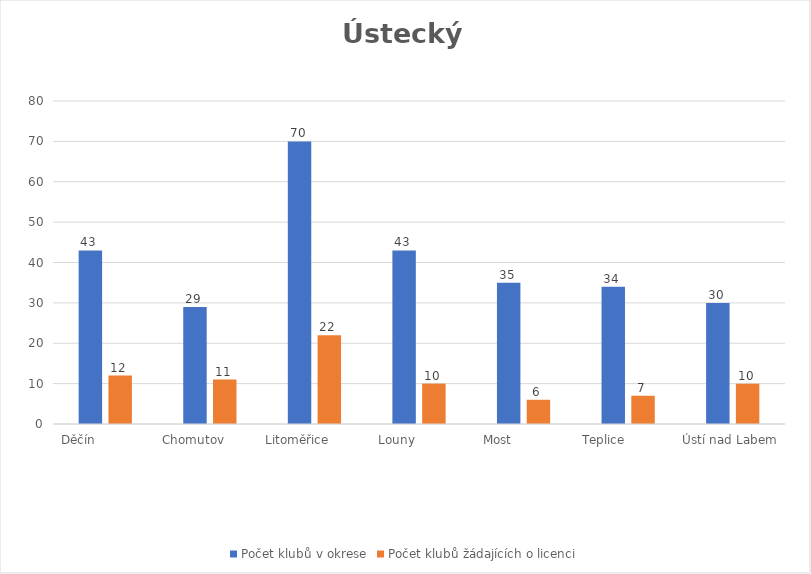
| Category | Počet klubů v okrese | Počet klubů žádajících o licenci |
|---|---|---|
| Děčín              | 43 | 12 |
| Chomutov         | 29 | 11 |
| Litoměřice         | 70 | 22 |
| Louny            | 43 | 10 |
| Most              | 35 | 6 |
| Teplice             | 34 | 7 |
| Ústí nad Labem   | 30 | 10 |